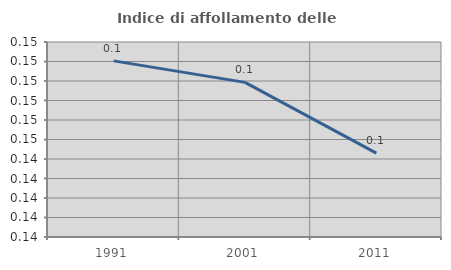
| Category | Indice di affollamento delle abitazioni  |
|---|---|
| 1991.0 | 0.149 |
| 2001.0 | 0.148 |
| 2011.0 | 0.144 |